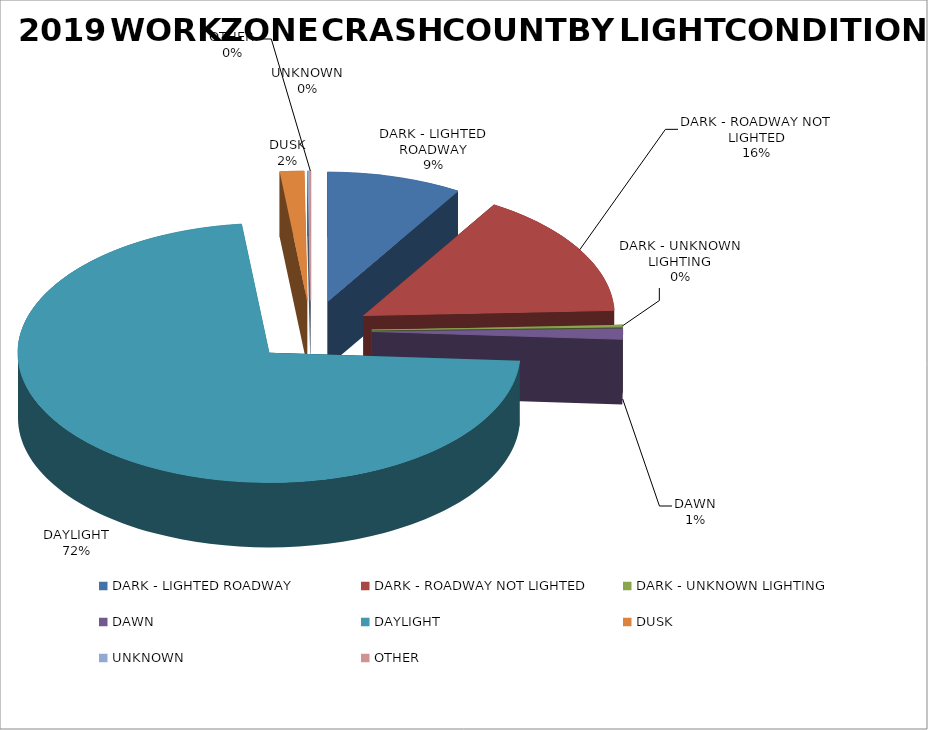
| Category | Series 0 | Series 1 |
|---|---|---|
| DARK - LIGHTED ROADWAY | 612 | 0.087 |
| DARK - ROADWAY NOT LIGHTED | 1101 | 0.157 |
| DARK - UNKNOWN LIGHTING | 18 | 0.003 |
| DAWN | 94 | 0.013 |
| DAYLIGHT | 5081 | 0.723 |
| DUSK | 109 | 0.016 |
| UNKNOWN | 10 | 0.001 |
| OTHER | 4 | 0.001 |